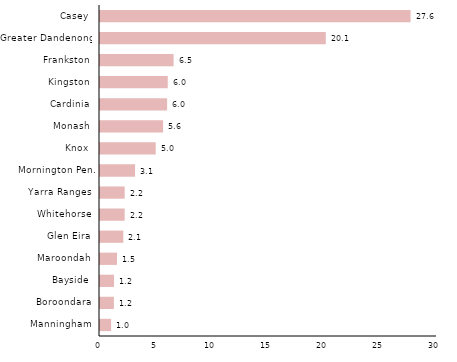
| Category | Series 0 |
|---|---|
| Casey  | 27.644 |
| Greater Dandenong  | 20.101 |
| Frankston  | 6.549 |
| Kingston  | 6.032 |
| Cardinia  | 5.974 |
| Monash  | 5.616 |
| Knox  | 4.96 |
| Mornington Pen. | 3.123 |
| Yarra Ranges  | 2.196 |
| Whitehorse  | 2.195 |
| Glen Eira  | 2.074 |
| Maroondah  | 1.516 |
| Bayside  | 1.245 |
| Boroondara  | 1.237 |
| Manningham  | 0.989 |